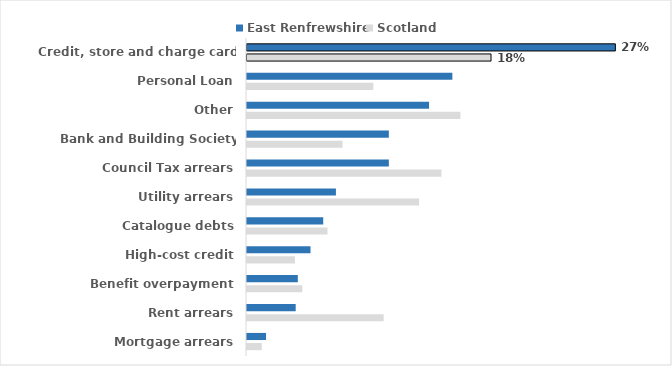
| Category | East Renfrewshire | Scotland |
|---|---|---|
| Credit, store and charge card debts | 0.266 | 0.176 |
| Personal Loan | 0.148 | 0.091 |
| Other | 0.131 | 0.154 |
| Bank and Building Society overdrafts | 0.102 | 0.069 |
| Council Tax arrears | 0.102 | 0.14 |
| Utility arrears | 0.064 | 0.124 |
| Catalogue debts | 0.055 | 0.058 |
| High-cost credit | 0.046 | 0.035 |
| Benefit overpayment | 0.037 | 0.04 |
| Rent arrears | 0.035 | 0.099 |
| Mortgage arrears | 0.014 | 0.011 |